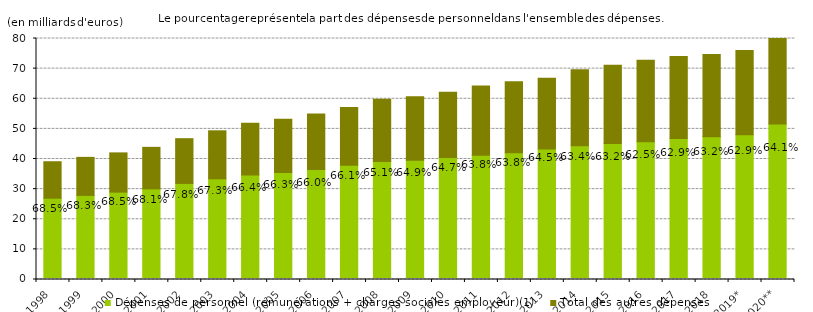
| Category | % | Dépenses de personnel (rémunérations + charges sociales employeur)(1) | Total des autres dépenses |
|---|---|---|---|
| 1998.0 | 0.685 | 26.3 | 12.113 |
| 1999.0 | 0.683 | 27.23 | 12.628 |
| 2000.0 | 0.685 | 28.318 | 13.027 |
| 2001.0 | 0.681 | 29.399 | 13.793 |
| 2002.0 | 0.678 | 31.211 | 14.855 |
| 2003.0 | 0.673 | 32.749 | 15.935 |
| 2004.0 | 0.664 | 34.005 | 17.227 |
| 2005.0 | 0.663 | 34.84 | 17.73 |
| 2006.0 | 0.66 | 35.851 | 18.457 |
| 2007.0 | 0.661 | 37.281 | 19.138 |
| 2008.0 | 0.651 | 38.546 | 20.669 |
| 2009.0 | 0.649 | 38.93 | 21.08 |
| 2010.0 | 0.647 | 39.831 | 21.704 |
| 2011.0 | 0.638 | 40.593 | 23.001 |
| 2012.0 | 0.638 | 41.459 | 23.528 |
| 2013.0 | 0.645 | 42.653 | 23.523 |
| 2014.0 | 0.634 | 43.786 | 25.232 |
| 2015.0 | 0.632 | 44.541 | 25.943 |
| 2016.0 | 0.625 | 45.117 | 27.02 |
| 2017.0 | 0.629 | 46.201 | 27.235 |
| 2018.0 | 0.632 | 46.75 | 27.277 |
| 2019.0 | 0.629 | 47.451 | 27.973 |
| 2020.0 | 0.641 | 51.018 | 28.589 |